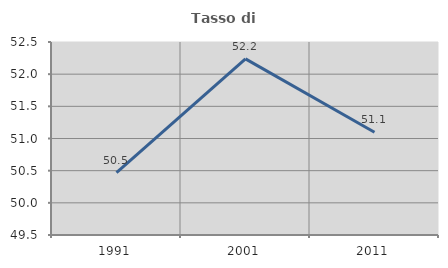
| Category | Tasso di occupazione   |
|---|---|
| 1991.0 | 50.469 |
| 2001.0 | 52.238 |
| 2011.0 | 51.098 |